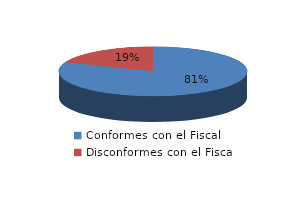
| Category | Series 0 |
|---|---|
| 0 | 47 |
| 1 | 11 |